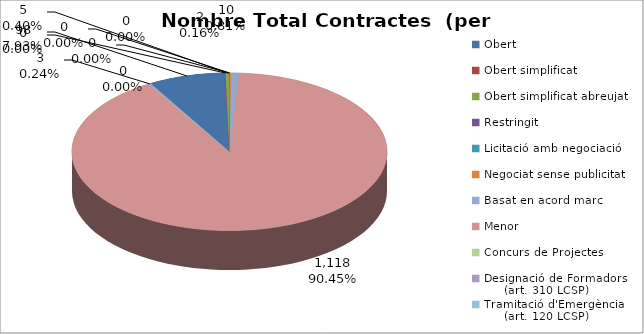
| Category | Nombre Total Contractes |
|---|---|
| Obert | 98 |
| Obert simplificat | 0 |
| Obert simplificat abreujat | 5 |
| Restringit | 0 |
| Licitació amb negociació | 0 |
| Negociat sense publicitat | 2 |
| Basat en acord marc | 10 |
| Menor | 1118 |
| Concurs de Projectes | 0 |
| Designació de Formadors
     (art. 310 LCSP) | 3 |
| Tramitació d'Emergència
     (art. 120 LCSP) | 0 |